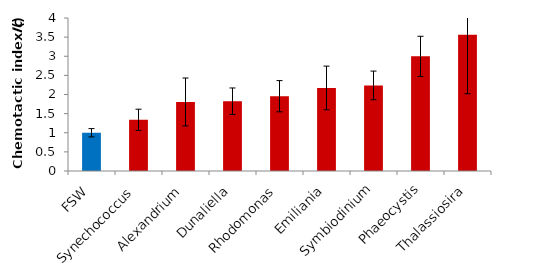
| Category | Series 0 |
|---|---|
| FSW | 1 |
| Synechococcus | 1.338 |
| Alexandrium | 1.805 |
| Dunaliella | 1.825 |
| Rhodomonas | 1.955 |
| Emiliania | 2.171 |
| Symbiodinium | 2.239 |
| Phaeocystis | 2.998 |
| Thalassiosira | 3.559 |